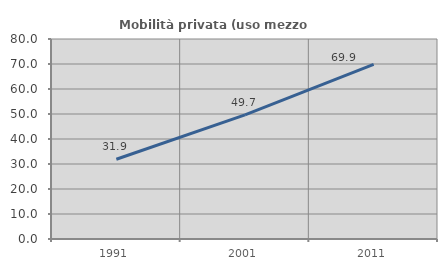
| Category | Mobilità privata (uso mezzo privato) |
|---|---|
| 1991.0 | 31.901 |
| 2001.0 | 49.671 |
| 2011.0 | 69.868 |